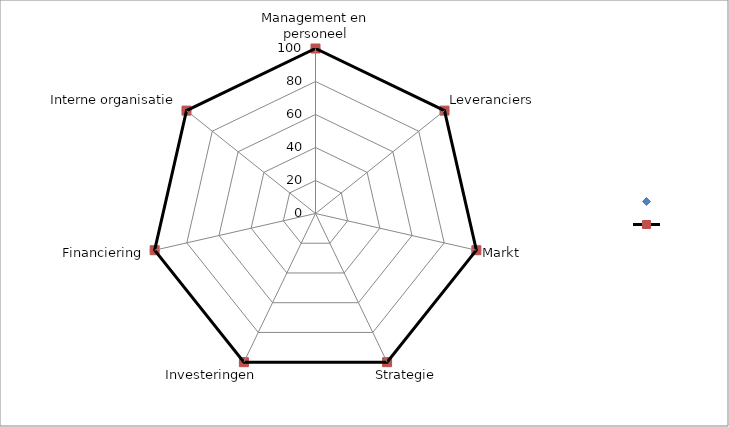
| Category | Norm | Klant x |
|---|---|---|
| Management en personeel | 100 | 100 |
| Leveranciers | 100 | 100 |
| Markt | 100 | 100 |
| Strategie | 100 | 100 |
| Investeringen | 100 | 100 |
| Financiering | 100 | 100 |
| Interne organisatie | 100 | 100 |